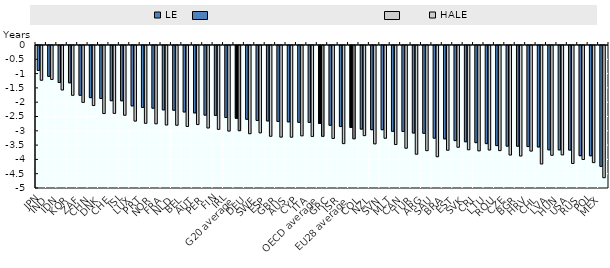
| Category | LE | HALE |
|---|---|---|
| JPN | -0.871 | -1.215 |
| IND | -1.08 | -1.186 |
| IDN | -1.295 | -1.554 |
| KOR | -1.304 | -1.741 |
| ZAF | -1.741 | -1.989 |
| CHN | -1.823 | -2.099 |
| DNK | -1.852 | -2.379 |
| CHE | -1.93 | -2.373 |
| ISL | -1.933 | -2.439 |
| LUX | -2.111 | -2.643 |
| PRT | -2.166 | -2.721 |
| NOR | -2.192 | -2.738 |
| FRA | -2.25 | -2.779 |
| NLD | -2.263 | -2.788 |
| BEL | -2.324 | -2.83 |
| AUT | -2.357 | -2.764 |
| PER | -2.434 | -2.884 |
| FIN | -2.444 | -2.932 |
| IRL | -2.519 | -2.992 |
| G20 average | -2.544 | -2.978 |
| DEU | -2.58 | -3.084 |
| SWE | -2.621 | -3.054 |
| ESP | -2.637 | -3.174 |
| GBR | -2.655 | -3.203 |
| AUS | -2.67 | -3.206 |
| CYP | -2.687 | -3.158 |
| ITA | -2.689 | -3.18 |
| OECD average | -2.727 | -3.176 |
| GRC | -2.79 | -3.249 |
| ISR | -2.833 | -3.431 |
| EU28 average | -2.866 | -3.261 |
| COL | -2.923 | -3.152 |
| NZL | -2.944 | -3.439 |
| SVN | -2.944 | -3.243 |
| MLT | -3.001 | -3.463 |
| CAN | -3.005 | -3.591 |
| TUR | -3.06 | -3.801 |
| ARG | -3.07 | -3.677 |
| SAU | -3.24 | -3.888 |
| BRA | -3.264 | -3.662 |
| EST | -3.325 | -3.558 |
| SVK | -3.364 | -3.645 |
| CRI | -3.396 | -3.683 |
| LTU | -3.431 | -3.654 |
| ROU | -3.499 | -3.675 |
| CZE | -3.518 | -3.83 |
| BGR | -3.521 | -3.863 |
| HRV | -3.534 | -3.691 |
| CHL | -3.549 | -4.142 |
| LVA | -3.648 | -3.839 |
| HUN | -3.65 | -3.824 |
| USA | -3.655 | -4.125 |
| RUS | -3.853 | -3.987 |
| POL | -3.856 | -4.094 |
| MEX | -4.225 | -4.622 |